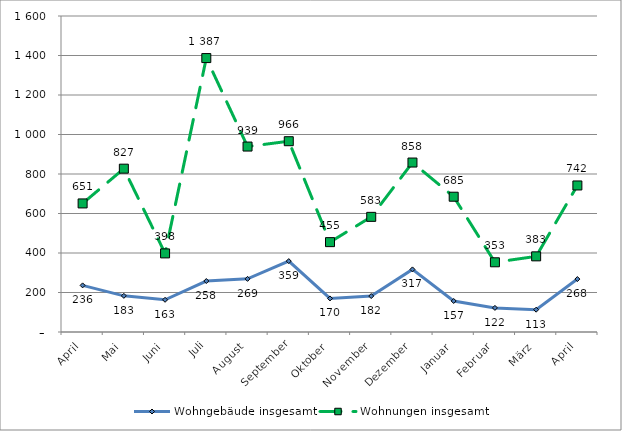
| Category | Wohngebäude insgesamt | Wohnungen insgesamt |
|---|---|---|
| April | 236 | 651 |
| Mai | 183 | 827 |
| Juni | 163 | 398 |
| Juli | 258 | 1387 |
| August | 269 | 939 |
| September | 359 | 966 |
| Oktober | 170 | 455 |
| November | 182 | 583 |
| Dezember | 317 | 858 |
| Januar | 157 | 685 |
| Februar | 122 | 353 |
| März | 113 | 383 |
| April | 268 | 742 |